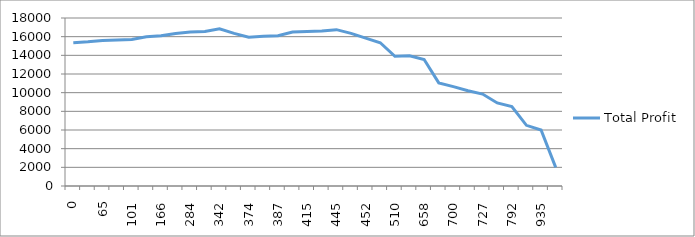
| Category | Total Profit |
|---|---|
| 0.0 | 15350 |
| 8.0 | 15450 |
| 65.0 | 15600 |
| 73.0 | 15650 |
| 101.0 | 15700 |
| 103.0 | 16000 |
| 166.0 | 16100 |
| 168.0 | 16350 |
| 284.0 | 16500 |
| 309.0 | 16550 |
| 342.0 | 16850 |
| 351.0 | 16350 |
| 374.0 | 15950 |
| 385.0 | 16050 |
| 387.0 | 16100 |
| 407.0 | 16500 |
| 415.0 | 16550 |
| 443.0 | 16600 |
| 445.0 | 16750 |
| 450.0 | 16350 |
| 452.0 | 15850 |
| 508.0 | 15350 |
| 510.0 | 13900 |
| 651.0 | 13950 |
| 658.0 | 13550 |
| 691.0 | 11050 |
| 700.0 | 10650 |
| 716.0 | 10200 |
| 727.0 | 9850 |
| 729.0 | 8900 |
| 792.0 | 8500 |
| 794.0 | 6500 |
| 935.0 | 6000 |
| 1000.0 | 2000 |